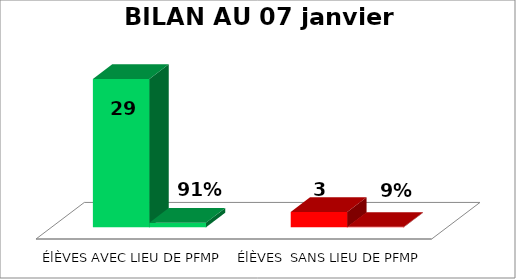
| Category | Series 0 | Series 1 |
|---|---|---|
| ÉlÈVES AVEC LIEU DE PFMP | 29 | 0.906 |
| ÉlÈVES  SANS LIEU DE PFMP | 3 | 0.094 |